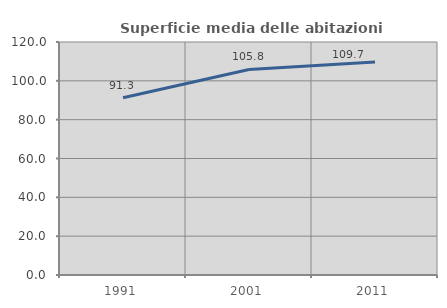
| Category | Superficie media delle abitazioni occupate |
|---|---|
| 1991.0 | 91.29 |
| 2001.0 | 105.848 |
| 2011.0 | 109.659 |